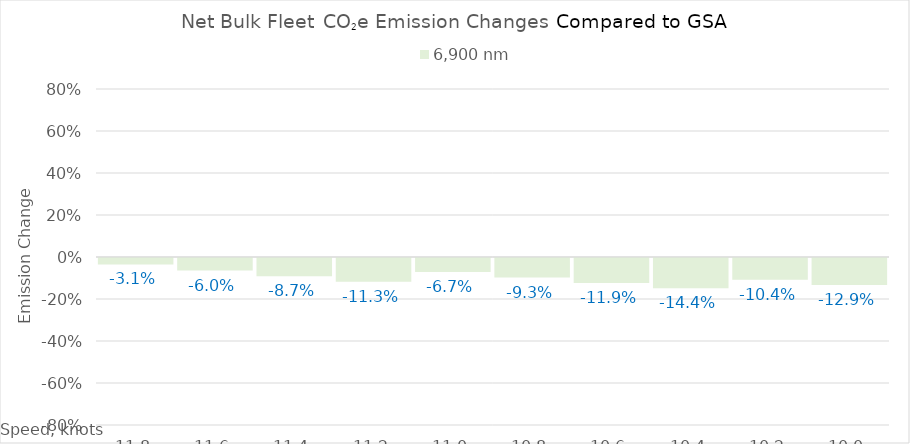
| Category | 6,900 |
|---|---|
| 11.8 | -0.031 |
| 11.600000000000001 | -0.06 |
| 11.400000000000002 | -0.087 |
| 11.200000000000003 | -0.113 |
| 11.000000000000004 | -0.067 |
| 10.800000000000004 | -0.093 |
| 10.600000000000005 | -0.119 |
| 10.400000000000006 | -0.144 |
| 10.200000000000006 | -0.104 |
| 10.000000000000007 | -0.129 |